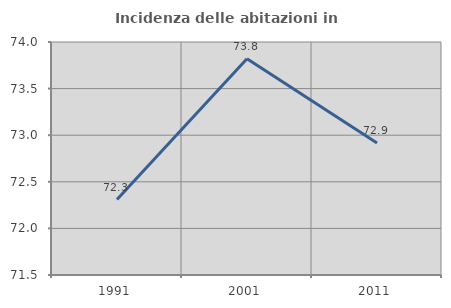
| Category | Incidenza delle abitazioni in proprietà  |
|---|---|
| 1991.0 | 72.309 |
| 2001.0 | 73.82 |
| 2011.0 | 72.917 |